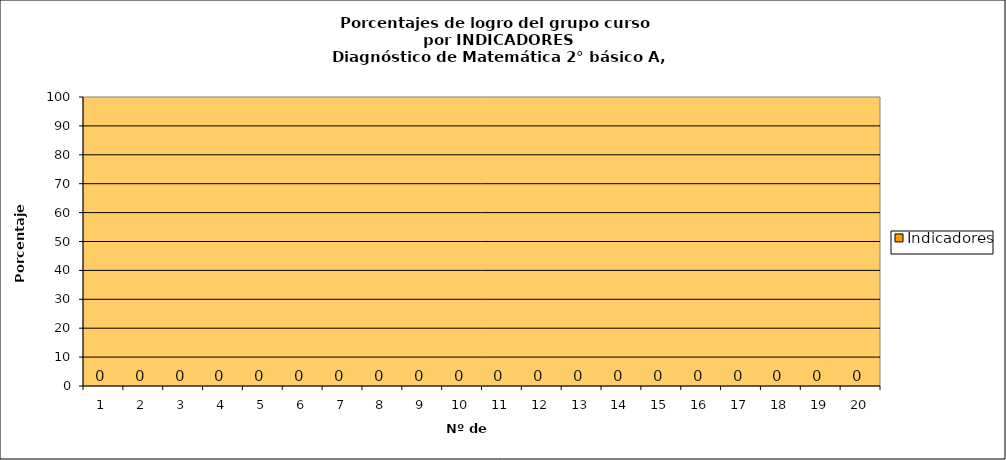
| Category | Indicadores |
|---|---|
| 0 | 0 |
| 1 | 0 |
| 2 | 0 |
| 3 | 0 |
| 4 | 0 |
| 5 | 0 |
| 6 | 0 |
| 7 | 0 |
| 8 | 0 |
| 9 | 0 |
| 10 | 0 |
| 11 | 0 |
| 12 | 0 |
| 13 | 0 |
| 14 | 0 |
| 15 | 0 |
| 16 | 0 |
| 17 | 0 |
| 18 | 0 |
| 19 | 0 |